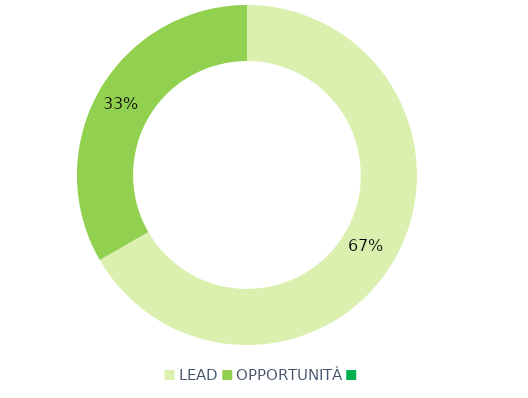
| Category | Series 0 |
|---|---|
| LEAD | 44 |
| OPPORTUNITÀ | 22 |